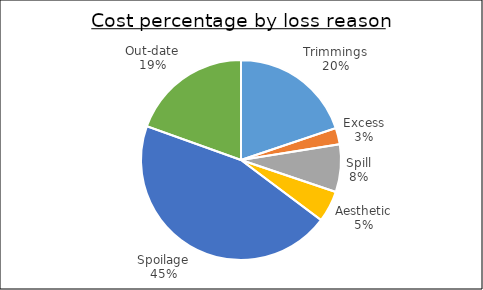
| Category | Series 0 |
|---|---|
| Trimmings | 1.678 |
| Excess | 0.223 |
| Spill | 0.651 |
| Aesthetic | 0.429 |
| Spoilage | 3.826 |
| Out-date | 1.651 |